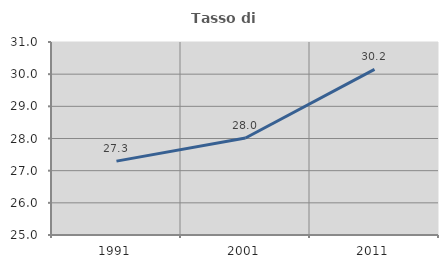
| Category | Tasso di occupazione   |
|---|---|
| 1991.0 | 27.297 |
| 2001.0 | 28.014 |
| 2011.0 | 30.151 |